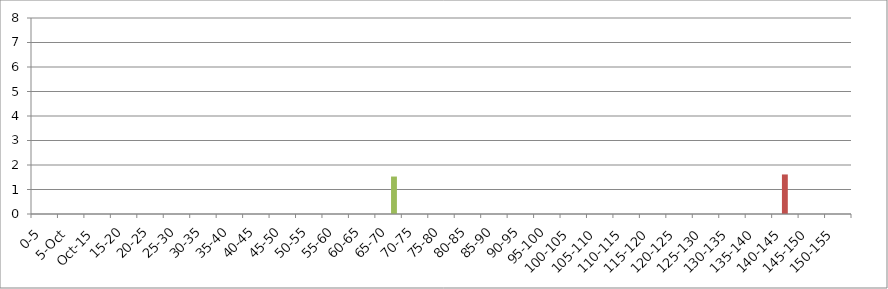
| Category | UNION_ALL | INTERSECTION_ALL | UNION(INTERSECTION_119875_146067,INTERSECTION_119875_241240,INTERSECTION_146067_241240) |
|---|---|---|---|
| 0-5 | 0 | 0 | 0 |
| 5-Oct | 0 | 0 | 0 |
| Oct-15 | 0 | 0 | 0 |
| 15-20 | 0 | 0 | 0 |
| 20-25 | 0 | 0 | 0 |
| 25-30 | 0 | 0 | 0 |
| 30-35 | 0 | 0 | 0 |
| 35-40 | 0 | 0 | 0 |
| 40-45 | 0 | 0 | 0 |
| 45-50 | 0 | 0 | 0 |
| 50-55 | 0 | 0 | 0 |
| 55-60 | 0 | 0 | 0 |
| 60-65 | 0 | 0 | 0 |
| 65-70 | 0 | 0 | 1.529 |
| 70-75 | 0 | 0 | 0 |
| 75-80 | 0 | 0 | 0 |
| 80-85 | 0 | 0 | 0 |
| 85-90 | 0 | 0 | 0 |
| 90-95 | 0 | 0 | 0 |
| 95-100 | 0 | 0 | 0 |
| 100-105 | 0 | 0 | 0 |
| 105-110 | 0 | 0 | 0 |
| 110-115 | 0 | 0 | 0 |
| 115-120 | 0 | 0 | 0 |
| 120-125 | 0 | 0 | 0 |
| 125-130 | 0 | 0 | 0 |
| 130-135 | 0 | 0 | 0 |
| 135-140 | 0 | 0 | 0 |
| 140-145 | 0 | 1.614 | 0 |
| 145-150 | 0 | 0 | 0 |
| 150-155 | 0 | 0 | 0 |